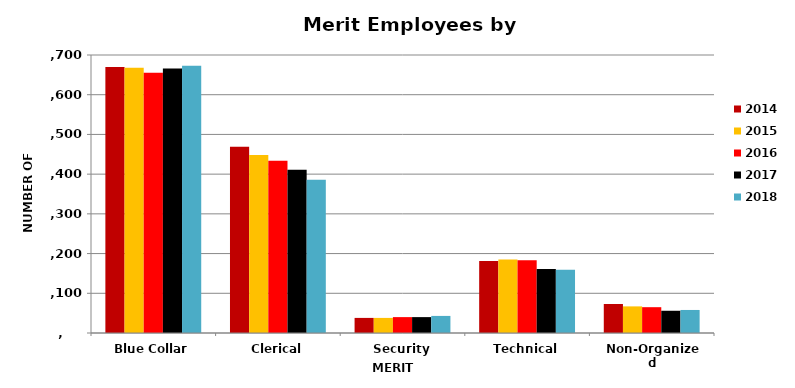
| Category | 2014 | 2015 | 2016 | 2017 | 2018 |
|---|---|---|---|---|---|
| Blue Collar | 670 | 668 | 655 | 666 | 673 |
| Clerical | 469 | 448 | 434 | 411 | 386 |
| Security | 38 | 38 | 40 | 40 | 43 |
| Technical | 181 | 185 | 183 | 161 | 159 |
| Non-Organized | 73 | 67 | 65 | 56 | 58 |